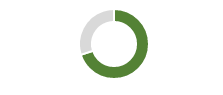
| Category | Series 0 |
|---|---|
| 0 | 0.7 |
| 1 | 0.3 |